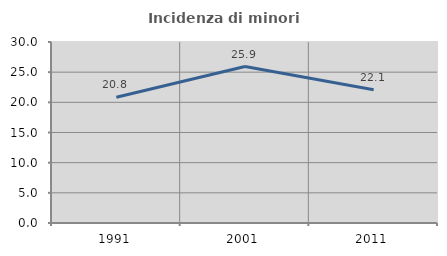
| Category | Incidenza di minori stranieri |
|---|---|
| 1991.0 | 20.833 |
| 2001.0 | 25.926 |
| 2011.0 | 22.078 |